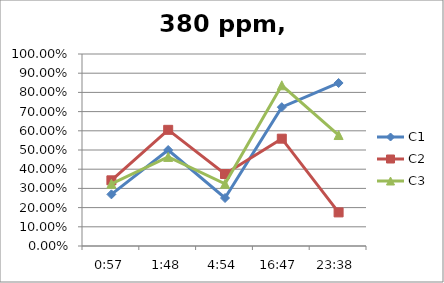
| Category | C1 | C2 | C3 |
|---|---|---|---|
| 0.0395833333333333 | 0.269 | 0.342 | 0.324 |
| 0.0750000000000001 | 0.5 | 0.605 | 0.464 |
| 0.204166666666667 | 0.25 | 0.375 | 0.324 |
| 1900-01-23 16:47:00 | 0.723 | 0.559 | 0.837 |
| 1900-01-23 23:38:00 | 0.849 | 0.175 | 0.578 |